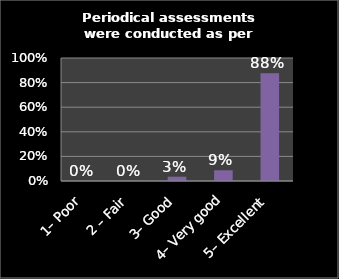
| Category | Series 0 |
|---|---|
| 1– Poor | 0 |
| 2 – Fair | 0.002 |
| 3– Good | 0.035 |
| 4– Very good | 0.087 |
| 5– Excellent | 0.877 |